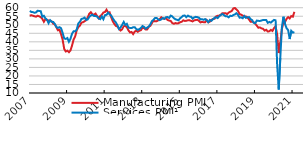
| Category | Manufacturing PMI | Services PMI¹ |
|---|---|---|
| 2007-01-15 | 55.308 | 58.122 |
| 2007-02-15 | 55.617 | 57.487 |
| 2007-03-15 | 55.282 | 57.397 |
| 2007-04-15 | 54.974 | 57.041 |
| 2007-05-15 | 54.74 | 57.244 |
| 2007-06-15 | 55.291 | 58.217 |
| 2007-07-15 | 54.943 | 58.087 |
| 2007-08-15 | 54.469 | 57.945 |
| 2007-09-15 | 53.461 | 54.697 |
| 2007-10-15 | 51.746 | 55.285 |
| 2007-11-15 | 53.343 | 53.718 |
| 2007-12-15 | 52.792 | 52.989 |
| 2008-01-15 | 52.557 | 50.924 |
| 2008-02-15 | 52.258 | 52.627 |
| 2008-03-15 | 51.998 | 51.712 |
| 2008-04-15 | 50.619 | 51.663 |
| 2008-05-15 | 50.214 | 50.436 |
| 2008-06-15 | 48.492 | 48.743 |
| 2008-07-15 | 46.748 | 48.148 |
| 2008-08-15 | 47.071 | 48.594 |
| 2008-09-15 | 44.391 | 47.961 |
| 2008-10-15 | 41.172 | 45.104 |
| 2008-11-15 | 35.811 | 42.001 |
| 2008-12-15 | 34.316 | 41.703 |
| 2009-01-15 | 34.784 | 42.222 |
| 2009-02-15 | 33.905 | 40.014 |
| 2009-03-15 | 34.971 | 41.838 |
| 2009-04-15 | 37.86 | 44.774 |
| 2009-05-15 | 41.361 | 46.212 |
| 2009-06-15 | 43.26 | 46.085 |
| 2009-07-15 | 46.796 | 47.272 |
| 2009-08-15 | 48.653 | 50.801 |
| 2009-09-15 | 49.438 | 51.757 |
| 2009-10-15 | 51.223 | 53.397 |
| 2009-11-15 | 51.504 | 53.667 |
| 2009-12-15 | 52.043 | 54.19 |
| 2010-01-15 | 52.678 | 52.855 |
| 2010-02-15 | 54.3 | 53.147 |
| 2010-03-15 | 56.506 | 54.59 |
| 2010-04-15 | 57.36 | 55.46 |
| 2010-05-15 | 56.092 | 55.9 |
| 2010-06-15 | 55.886 | 55.178 |
| 2010-07-15 | 56.587 | 55.116 |
| 2010-08-15 | 55.101 | 54.81 |
| 2010-09-15 | 53.774 | 53.731 |
| 2010-10-15 | 55.109 | 53.284 |
| 2010-11-15 | 55.869 | 54.895 |
| 2010-12-15 | 57.172 | 53.243 |
| 2011-01-15 | 57.472 | 55.617 |
| 2011-02-15 | 58.843 | 55.802 |
| 2011-03-15 | 57.178 | 57.093 |
| 2011-04-15 | 57.307 | 56.099 |
| 2011-05-15 | 54.338 | 55.413 |
| 2011-06-15 | 52.066 | 53.74 |
| 2011-07-15 | 50.491 | 52.375 |
| 2011-08-15 | 49.315 | 51.306 |
| 2011-09-15 | 48.977 | 49.672 |
| 2011-10-15 | 47.631 | 47.512 |
| 2011-11-15 | 46.648 | 48.451 |
| 2011-12-15 | 47.336 | 49.92 |
| 2012-01-15 | 49.173 | 51.656 |
| 2012-02-15 | 49.288 | 49.914 |
| 2012-03-15 | 48.529 | 50.536 |
| 2012-04-15 | 46.705 | 48.326 |
| 2012-05-15 | 45.526 | 48.165 |
| 2012-06-15 | 45.774 | 48.043 |
| 2012-07-15 | 44.528 | 48.555 |
| 2012-08-15 | 45.974 | 48.603 |
| 2012-09-15 | 46.515 | 47.49 |
| 2012-10-15 | 45.88 | 47.038 |
| 2012-11-15 | 46.528 | 47.503 |
| 2012-12-15 | 46.814 | 48.123 |
| 2013-01-15 | 48.326 | 49.26 |
| 2013-02-15 | 48.018 | 48.759 |
| 2013-03-15 | 47.226 | 47.716 |
| 2013-04-15 | 47.287 | 48.344 |
| 2013-05-15 | 48.821 | 48.954 |
| 2013-06-15 | 49.398 | 50.209 |
| 2013-07-15 | 50.929 | 52.118 |
| 2013-08-15 | 52.429 | 52.895 |
| 2013-09-15 | 51.986 | 54.013 |
| 2013-10-15 | 52.054 | 54.007 |
| 2013-11-15 | 52.594 | 53.163 |
| 2013-12-15 | 53.285 | 52.722 |
| 2014-01-15 | 54.388 | 53.189 |
| 2014-02-15 | 53.753 | 53.928 |
| 2014-03-15 | 53.369 | 53.467 |
| 2014-04-15 | 53.937 | 54.456 |
| 2014-05-15 | 52.819 | 54.507 |
| 2014-06-15 | 52.474 | 53.992 |
| 2014-07-15 | 52.226 | 55.354 |
| 2014-08-15 | 51.02 | 54.889 |
| 2014-09-15 | 50.569 | 53.876 |
| 2014-10-15 | 50.985 | 53.223 |
| 2014-11-15 | 50.756 | 52.92 |
| 2014-12-15 | 50.932 | 52.616 |
| 2015-01-15 | 51.468 | 53.825 |
| 2015-02-15 | 51.751 | 54.472 |
| 2015-03-15 | 52.627 | 55.338 |
| 2015-04-15 | 52.244 | 55.397 |
| 2015-05-15 | 52.323 | 54.428 |
| 2015-06-15 | 52.636 | 55.376 |
| 2015-07-15 | 52.641 | 54.798 |
| 2015-08-15 | 52.291 | 54.72 |
| 2015-09-15 | 51.969 | 53.585 |
| 2015-10-15 | 52.577 | 54.287 |
| 2015-11-15 | 52.761 | 54.636 |
| 2015-12-15 | 52.919 | 54.501 |
| 2016-01-15 | 52.369 | 54.12 |
| 2016-02-15 | 51.385 | 53.16 |
| 2016-03-15 | 51.692 | 53.259 |
| 2016-04-15 | 51.507 | 52.92 |
| 2016-05-15 | 51.429 | 53.354 |
| 2016-06-15 | 52.763 | 52.655 |
| 2016-07-15 | 51.432 | 51.514 |
| 2016-08-15 | 51.845 | 52.827 |
| 2016-09-15 | 52.885 | 52.307 |
| 2016-10-15 | 53.383 | 53.267 |
| 2016-11-15 | 53.487 | 54.129 |
| 2016-12-15 | 54.895 | 54.365 |
| 2017-01-15 | 55.242 | 53.906 |
| 2017-02-15 | 55.359 | 54.996 |
| 2017-03-15 | 55.923 | 55.742 |
| 2017-04-15 | 56.735 | 56.29 |
| 2017-05-15 | 56.766 | 55.683 |
| 2017-06-15 | 56.814 | 54.977 |
| 2017-07-15 | 56.251 | 54.997 |
| 2017-08-15 | 57.105 | 54.369 |
| 2017-09-15 | 57.633 | 55.269 |
| 2017-10-15 | 58.09 | 55.134 |
| 2017-11-15 | 59.58 | 55.677 |
| 2017-12-15 | 59.814 | 56.08 |
| 2018-01-15 | 58.928 | 56.797 |
| 2018-02-15 | 58.051 | 55.794 |
| 2018-03-15 | 56.272 | 54.166 |
| 2018-04-15 | 55.915 | 54.291 |
| 2018-05-15 | 55.343 | 53.823 |
| 2018-06-15 | 54.871 | 55.149 |
| 2018-07-15 | 54.868 | 54.055 |
| 2018-08-15 | 54.256 | 54.374 |
| 2018-09-15 | 53.11 | 54.491 |
| 2018-10-15 | 51.826 | 53.368 |
| 2018-11-15 | 51.828 | 52.728 |
| 2018-12-15 | 51.468 | 51.171 |
| 2019-01-15 | 50.556 | 50.903 |
| 2019-02-15 | 49.469 | 52.451 |
| 2019-03-15 | 48.27 | 52.291 |
| 2019-04-15 | 48.425 | 52.24 |
| 2019-05-15 | 47.892 | 52.48 |
| 2019-06-15 | 47.63 | 52.818 |
| 2019-07-15 | 46.593 | 52.782 |
| 2019-08-15 | 47.084 | 52.794 |
| 2019-09-15 | 46.026 | 51.131 |
| 2019-10-15 | 46.211 | 51.662 |
| 2019-11-15 | 47.011 | 51.241 |
| 2019-12-15 | 46.39 | 52.116 |
| 2020-01-15 | 48.061 | 52.838 |
| 2020-02-15 | 49.11 | 52.606 |
| 2020-03-15 | 44.26 | 26.421 |
| 2020-04-15 | 33.401 | 12.014 |
| 2020-05-15 | 39.513 | 30.489 |
| 2020-06-15 | 47.358 | 48.284 |
| 2020-07-15 | 51.731 | 54.695 |
| 2020-08-15 | 51.587 | 50.462 |
| 2020-09-15 | 53.481 | 48.002 |
| 2020-10-15 | 54.476 | 46.891 |
| 2020-11-15 | 53.69 | 41.658 |
| 2020-12-15 | 55.079 | 46.415 |
| 2021-01-15 | 54.717 | 45.416 |
| 2021-02-15 | 57.581 | 45.694 |